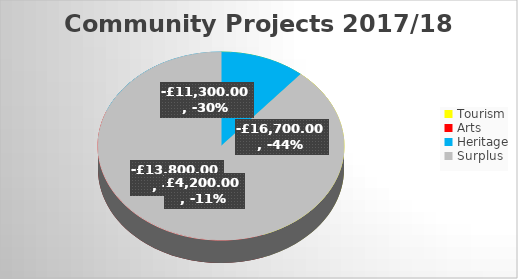
| Category | Series 0 |
|---|---|
| Tourism | -16700 |
| Arts | -13800 |
| Heritage | -11300 |
| Surplus | 4200 |